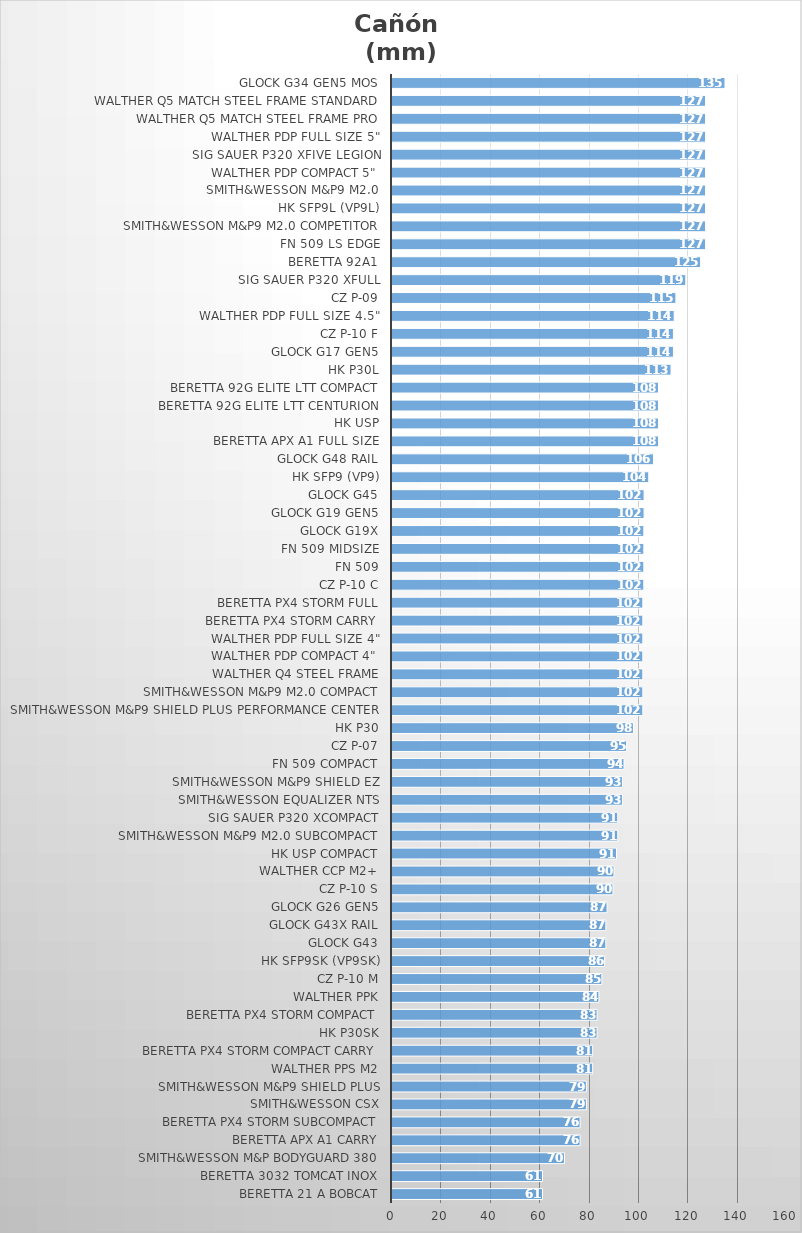
| Category | Cañón 
(mm) |
|---|---|
| Beretta 21 A Bobcat | 60.96 |
| Beretta 3032 Tomcat Inox | 60.96 |
| Smith&Wesson M&P Bodyguard 380 | 69.85 |
| Beretta APX A1 Carry | 76.2 |
| Beretta Px4 Storm SubCompact | 76.2 |
| Smith&Wesson CSX | 78.74 |
| Smith&Wesson M&P9 Shield Plus | 78.74 |
| Walther PPS M2 | 81.28 |
| Beretta Px4 Storm Compact Carry | 81.28 |
| HK P30SK | 83.058 |
| Beretta Px4 Storm Compact | 83.058 |
| Walther PPK | 83.82 |
| CZ P-10 M | 85 |
| HK SFP9SK (VP9SK) | 86.106 |
| Glock G43 | 86.614 |
| Glock G43X Rail | 86.614 |
| Glock G26 Gen5 | 87.122 |
| CZ P-10 S | 89.5 |
| Walther CCP M2+ | 89.916 |
| HK USP Compact | 90.932 |
| Smith&Wesson M&P9 M2.0 Subcompact | 91.44 |
| SIG Sauer P320 XCOMPACT | 91.44 |
| Smith&Wesson Equalizer NTS | 93.345 |
| Smith&Wesson M&P9 Shield EZ | 93.345 |
| FN 509 Compact | 93.98 |
| CZ P-07 | 95 |
| HK P30 | 97.79 |
| Smith&Wesson M&P9 Shield Plus Performance Center | 101.6 |
| Smith&Wesson M&P9 M2.0 Compact | 101.6 |
| Walther Q4 Steel Frame | 101.6 |
| Walther PDP Compact 4" | 101.6 |
| Walther PDP Full Size 4" | 101.6 |
| Beretta Px4 Storm Carry | 101.6 |
| Beretta Px4 Storm Full | 101.6 |
| CZ P-10 C | 102 |
| FN 509 | 102 |
| FN 509 Midsize | 102 |
| Glock G19X | 102 |
| Glock G19 Gen5 | 102.108 |
| Glock G45 | 102.108 |
| HK SFP9 (VP9) | 104 |
| Glock G48 Rail | 105.918 |
| Beretta APX A1 Full Size | 107.95 |
| HK USP | 107.95 |
| Beretta 92G Elite LTT Centurion | 107.95 |
| Beretta 92G Elite LTT Compact | 107.95 |
| HK P30L | 113.03 |
| Glock G17 Gen5 | 114 |
| CZ P-10 F | 114 |
| Walther PDP Full Size 4.5" | 114.3 |
| CZ P-09 | 115 |
| SIG Sauer P320 XFULL | 119 |
| Beretta 92A1 | 125 |
| FN 509 LS Edge | 127 |
| Smith&Wesson M&P9 M2.0 Competitor | 127 |
| HK SFP9L (VP9L) | 127 |
| Smith&Wesson M&P9 M2.0 | 127 |
| Walther PDP Compact 5" | 127 |
| SIG Sauer P320 XFIVE Legion | 127 |
| Walther PDP Full Size 5" | 127 |
| Walther Q5 Match Steel Frame Pro | 127 |
| Walther Q5 Match Steel Frame Standard | 127 |
| Glock G34 Gen5 MOS | 134.874 |